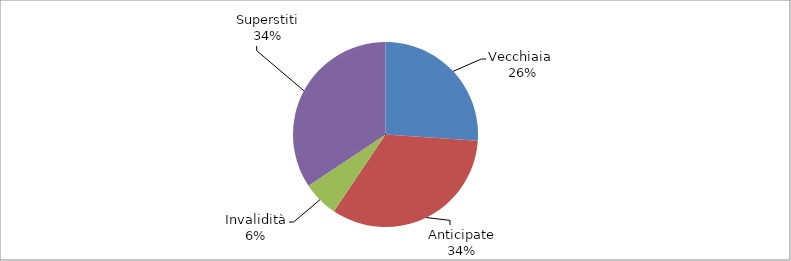
| Category | Series 0 |
|---|---|
| Vecchiaia  | 18288 |
| Anticipate | 23392 |
| Invalidità | 4383 |
| Superstiti | 24086 |